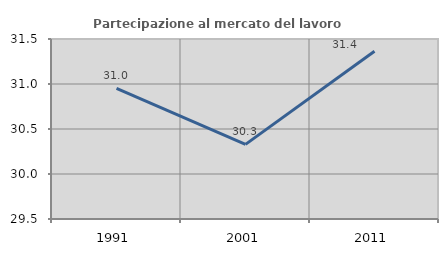
| Category | Partecipazione al mercato del lavoro  femminile |
|---|---|
| 1991.0 | 30.952 |
| 2001.0 | 30.329 |
| 2011.0 | 31.363 |